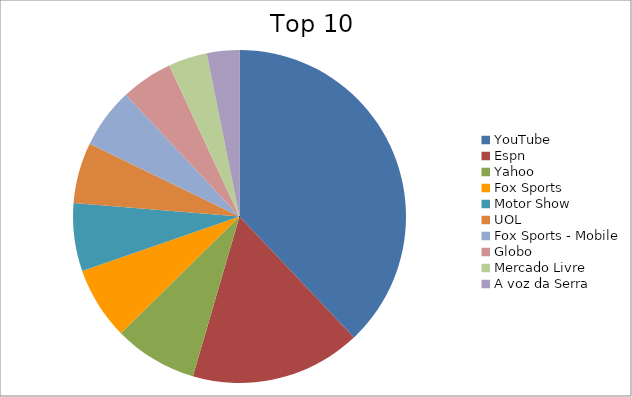
| Category | Series 0 |
|---|---|
| YouTube | 23.33 |
| Espn | 10.19 |
| Yahoo | 4.98 |
| Fox Sports | 4.34 |
| Motor Show | 4.06 |
| UOL | 3.63 |
| Fox Sports - Mobile | 3.6 |
| Globo | 3.09 |
| Mercado Livre | 2.32 |
| A voz da Serra | 1.94 |